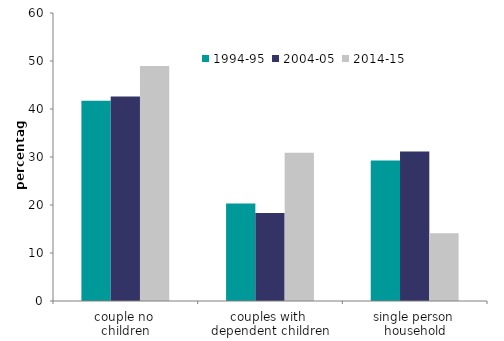
| Category | 1994-95 | 2004-05 | 2014-15 |
|---|---|---|---|
| couple no 
children | 41.735 | 42.617 | 48.969 |
| couples with 
dependent children | 20.298 | 18.318 | 30.897 |
| single person 
household | 29.278 | 31.155 | 14.137 |